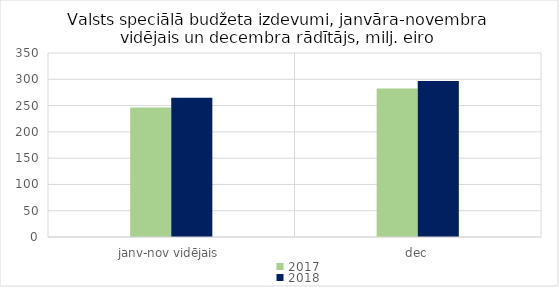
| Category | 2017 | 2018 |
|---|---|---|
| janv-nov vidējais | 246381.742 | 264809.109 |
| dec | 282446.284 | 296686.983 |